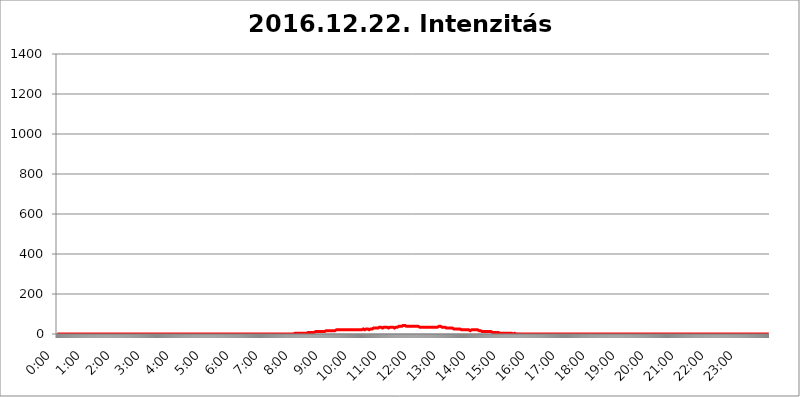
| Category | 2016.12.22. Intenzitás [W/m^2] |
|---|---|
| 0.0 | 0 |
| 0.0006944444444444445 | 0 |
| 0.001388888888888889 | 0 |
| 0.0020833333333333333 | 0 |
| 0.002777777777777778 | 0 |
| 0.003472222222222222 | 0 |
| 0.004166666666666667 | 0 |
| 0.004861111111111111 | 0 |
| 0.005555555555555556 | 0 |
| 0.0062499999999999995 | 0 |
| 0.006944444444444444 | 0 |
| 0.007638888888888889 | 0 |
| 0.008333333333333333 | 0 |
| 0.009027777777777779 | 0 |
| 0.009722222222222222 | 0 |
| 0.010416666666666666 | 0 |
| 0.011111111111111112 | 0 |
| 0.011805555555555555 | 0 |
| 0.012499999999999999 | 0 |
| 0.013194444444444444 | 0 |
| 0.013888888888888888 | 0 |
| 0.014583333333333332 | 0 |
| 0.015277777777777777 | 0 |
| 0.015972222222222224 | 0 |
| 0.016666666666666666 | 0 |
| 0.017361111111111112 | 0 |
| 0.018055555555555557 | 0 |
| 0.01875 | 0 |
| 0.019444444444444445 | 0 |
| 0.02013888888888889 | 0 |
| 0.020833333333333332 | 0 |
| 0.02152777777777778 | 0 |
| 0.022222222222222223 | 0 |
| 0.02291666666666667 | 0 |
| 0.02361111111111111 | 0 |
| 0.024305555555555556 | 0 |
| 0.024999999999999998 | 0 |
| 0.025694444444444447 | 0 |
| 0.02638888888888889 | 0 |
| 0.027083333333333334 | 0 |
| 0.027777777777777776 | 0 |
| 0.02847222222222222 | 0 |
| 0.029166666666666664 | 0 |
| 0.029861111111111113 | 0 |
| 0.030555555555555555 | 0 |
| 0.03125 | 0 |
| 0.03194444444444445 | 0 |
| 0.03263888888888889 | 0 |
| 0.03333333333333333 | 0 |
| 0.034027777777777775 | 0 |
| 0.034722222222222224 | 0 |
| 0.035416666666666666 | 0 |
| 0.036111111111111115 | 0 |
| 0.03680555555555556 | 0 |
| 0.0375 | 0 |
| 0.03819444444444444 | 0 |
| 0.03888888888888889 | 0 |
| 0.03958333333333333 | 0 |
| 0.04027777777777778 | 0 |
| 0.04097222222222222 | 0 |
| 0.041666666666666664 | 0 |
| 0.042361111111111106 | 0 |
| 0.04305555555555556 | 0 |
| 0.043750000000000004 | 0 |
| 0.044444444444444446 | 0 |
| 0.04513888888888889 | 0 |
| 0.04583333333333334 | 0 |
| 0.04652777777777778 | 0 |
| 0.04722222222222222 | 0 |
| 0.04791666666666666 | 0 |
| 0.04861111111111111 | 0 |
| 0.049305555555555554 | 0 |
| 0.049999999999999996 | 0 |
| 0.05069444444444445 | 0 |
| 0.051388888888888894 | 0 |
| 0.052083333333333336 | 0 |
| 0.05277777777777778 | 0 |
| 0.05347222222222222 | 0 |
| 0.05416666666666667 | 0 |
| 0.05486111111111111 | 0 |
| 0.05555555555555555 | 0 |
| 0.05625 | 0 |
| 0.05694444444444444 | 0 |
| 0.057638888888888885 | 0 |
| 0.05833333333333333 | 0 |
| 0.05902777777777778 | 0 |
| 0.059722222222222225 | 0 |
| 0.06041666666666667 | 0 |
| 0.061111111111111116 | 0 |
| 0.06180555555555556 | 0 |
| 0.0625 | 0 |
| 0.06319444444444444 | 0 |
| 0.06388888888888888 | 0 |
| 0.06458333333333334 | 0 |
| 0.06527777777777778 | 0 |
| 0.06597222222222222 | 0 |
| 0.06666666666666667 | 0 |
| 0.06736111111111111 | 0 |
| 0.06805555555555555 | 0 |
| 0.06874999999999999 | 0 |
| 0.06944444444444443 | 0 |
| 0.07013888888888889 | 0 |
| 0.07083333333333333 | 0 |
| 0.07152777777777779 | 0 |
| 0.07222222222222223 | 0 |
| 0.07291666666666667 | 0 |
| 0.07361111111111111 | 0 |
| 0.07430555555555556 | 0 |
| 0.075 | 0 |
| 0.07569444444444444 | 0 |
| 0.0763888888888889 | 0 |
| 0.07708333333333334 | 0 |
| 0.07777777777777778 | 0 |
| 0.07847222222222222 | 0 |
| 0.07916666666666666 | 0 |
| 0.0798611111111111 | 0 |
| 0.08055555555555556 | 0 |
| 0.08125 | 0 |
| 0.08194444444444444 | 0 |
| 0.08263888888888889 | 0 |
| 0.08333333333333333 | 0 |
| 0.08402777777777777 | 0 |
| 0.08472222222222221 | 0 |
| 0.08541666666666665 | 0 |
| 0.08611111111111112 | 0 |
| 0.08680555555555557 | 0 |
| 0.08750000000000001 | 0 |
| 0.08819444444444445 | 0 |
| 0.08888888888888889 | 0 |
| 0.08958333333333333 | 0 |
| 0.09027777777777778 | 0 |
| 0.09097222222222222 | 0 |
| 0.09166666666666667 | 0 |
| 0.09236111111111112 | 0 |
| 0.09305555555555556 | 0 |
| 0.09375 | 0 |
| 0.09444444444444444 | 0 |
| 0.09513888888888888 | 0 |
| 0.09583333333333333 | 0 |
| 0.09652777777777777 | 0 |
| 0.09722222222222222 | 0 |
| 0.09791666666666667 | 0 |
| 0.09861111111111111 | 0 |
| 0.09930555555555555 | 0 |
| 0.09999999999999999 | 0 |
| 0.10069444444444443 | 0 |
| 0.1013888888888889 | 0 |
| 0.10208333333333335 | 0 |
| 0.10277777777777779 | 0 |
| 0.10347222222222223 | 0 |
| 0.10416666666666667 | 0 |
| 0.10486111111111111 | 0 |
| 0.10555555555555556 | 0 |
| 0.10625 | 0 |
| 0.10694444444444444 | 0 |
| 0.1076388888888889 | 0 |
| 0.10833333333333334 | 0 |
| 0.10902777777777778 | 0 |
| 0.10972222222222222 | 0 |
| 0.1111111111111111 | 0 |
| 0.11180555555555556 | 0 |
| 0.11180555555555556 | 0 |
| 0.1125 | 0 |
| 0.11319444444444444 | 0 |
| 0.11388888888888889 | 0 |
| 0.11458333333333333 | 0 |
| 0.11527777777777777 | 0 |
| 0.11597222222222221 | 0 |
| 0.11666666666666665 | 0 |
| 0.1173611111111111 | 0 |
| 0.11805555555555557 | 0 |
| 0.11944444444444445 | 0 |
| 0.12013888888888889 | 0 |
| 0.12083333333333333 | 0 |
| 0.12152777777777778 | 0 |
| 0.12222222222222223 | 0 |
| 0.12291666666666667 | 0 |
| 0.12291666666666667 | 0 |
| 0.12361111111111112 | 0 |
| 0.12430555555555556 | 0 |
| 0.125 | 0 |
| 0.12569444444444444 | 0 |
| 0.12638888888888888 | 0 |
| 0.12708333333333333 | 0 |
| 0.16875 | 0 |
| 0.12847222222222224 | 0 |
| 0.12916666666666668 | 0 |
| 0.12986111111111112 | 0 |
| 0.13055555555555556 | 0 |
| 0.13125 | 0 |
| 0.13194444444444445 | 0 |
| 0.1326388888888889 | 0 |
| 0.13333333333333333 | 0 |
| 0.13402777777777777 | 0 |
| 0.13402777777777777 | 0 |
| 0.13472222222222222 | 0 |
| 0.13541666666666666 | 0 |
| 0.1361111111111111 | 0 |
| 0.13749999999999998 | 0 |
| 0.13819444444444443 | 0 |
| 0.1388888888888889 | 0 |
| 0.13958333333333334 | 0 |
| 0.14027777777777778 | 0 |
| 0.14097222222222222 | 0 |
| 0.14166666666666666 | 0 |
| 0.1423611111111111 | 0 |
| 0.14305555555555557 | 0 |
| 0.14375000000000002 | 0 |
| 0.14444444444444446 | 0 |
| 0.1451388888888889 | 0 |
| 0.1451388888888889 | 0 |
| 0.14652777777777778 | 0 |
| 0.14722222222222223 | 0 |
| 0.14791666666666667 | 0 |
| 0.1486111111111111 | 0 |
| 0.14930555555555555 | 0 |
| 0.15 | 0 |
| 0.15069444444444444 | 0 |
| 0.15138888888888888 | 0 |
| 0.15208333333333332 | 0 |
| 0.15277777777777776 | 0 |
| 0.15347222222222223 | 0 |
| 0.15416666666666667 | 0 |
| 0.15486111111111112 | 0 |
| 0.15555555555555556 | 0 |
| 0.15625 | 0 |
| 0.15694444444444444 | 0 |
| 0.15763888888888888 | 0 |
| 0.15833333333333333 | 0 |
| 0.15902777777777777 | 0 |
| 0.15972222222222224 | 0 |
| 0.16041666666666668 | 0 |
| 0.16111111111111112 | 0 |
| 0.16180555555555556 | 0 |
| 0.1625 | 0 |
| 0.16319444444444445 | 0 |
| 0.1638888888888889 | 0 |
| 0.16458333333333333 | 0 |
| 0.16527777777777777 | 0 |
| 0.16597222222222222 | 0 |
| 0.16666666666666666 | 0 |
| 0.1673611111111111 | 0 |
| 0.16805555555555554 | 0 |
| 0.16874999999999998 | 0 |
| 0.16944444444444443 | 0 |
| 0.17013888888888887 | 0 |
| 0.1708333333333333 | 0 |
| 0.17152777777777775 | 0 |
| 0.17222222222222225 | 0 |
| 0.1729166666666667 | 0 |
| 0.17361111111111113 | 0 |
| 0.17430555555555557 | 0 |
| 0.17500000000000002 | 0 |
| 0.17569444444444446 | 0 |
| 0.1763888888888889 | 0 |
| 0.17708333333333334 | 0 |
| 0.17777777777777778 | 0 |
| 0.17847222222222223 | 0 |
| 0.17916666666666667 | 0 |
| 0.1798611111111111 | 0 |
| 0.18055555555555555 | 0 |
| 0.18125 | 0 |
| 0.18194444444444444 | 0 |
| 0.1826388888888889 | 0 |
| 0.18333333333333335 | 0 |
| 0.1840277777777778 | 0 |
| 0.18472222222222223 | 0 |
| 0.18541666666666667 | 0 |
| 0.18611111111111112 | 0 |
| 0.18680555555555556 | 0 |
| 0.1875 | 0 |
| 0.18819444444444444 | 0 |
| 0.18888888888888888 | 0 |
| 0.18958333333333333 | 0 |
| 0.19027777777777777 | 0 |
| 0.1909722222222222 | 0 |
| 0.19166666666666665 | 0 |
| 0.19236111111111112 | 0 |
| 0.19305555555555554 | 0 |
| 0.19375 | 0 |
| 0.19444444444444445 | 0 |
| 0.1951388888888889 | 0 |
| 0.19583333333333333 | 0 |
| 0.19652777777777777 | 0 |
| 0.19722222222222222 | 0 |
| 0.19791666666666666 | 0 |
| 0.1986111111111111 | 0 |
| 0.19930555555555554 | 0 |
| 0.19999999999999998 | 0 |
| 0.20069444444444443 | 0 |
| 0.20138888888888887 | 0 |
| 0.2020833333333333 | 0 |
| 0.2027777777777778 | 0 |
| 0.2034722222222222 | 0 |
| 0.2041666666666667 | 0 |
| 0.20486111111111113 | 0 |
| 0.20555555555555557 | 0 |
| 0.20625000000000002 | 0 |
| 0.20694444444444446 | 0 |
| 0.2076388888888889 | 0 |
| 0.20833333333333334 | 0 |
| 0.20902777777777778 | 0 |
| 0.20972222222222223 | 0 |
| 0.21041666666666667 | 0 |
| 0.2111111111111111 | 0 |
| 0.21180555555555555 | 0 |
| 0.2125 | 0 |
| 0.21319444444444444 | 0 |
| 0.2138888888888889 | 0 |
| 0.21458333333333335 | 0 |
| 0.2152777777777778 | 0 |
| 0.21597222222222223 | 0 |
| 0.21666666666666667 | 0 |
| 0.21736111111111112 | 0 |
| 0.21805555555555556 | 0 |
| 0.21875 | 0 |
| 0.21944444444444444 | 0 |
| 0.22013888888888888 | 0 |
| 0.22083333333333333 | 0 |
| 0.22152777777777777 | 0 |
| 0.2222222222222222 | 0 |
| 0.22291666666666665 | 0 |
| 0.2236111111111111 | 0 |
| 0.22430555555555556 | 0 |
| 0.225 | 0 |
| 0.22569444444444445 | 0 |
| 0.2263888888888889 | 0 |
| 0.22708333333333333 | 0 |
| 0.22777777777777777 | 0 |
| 0.22847222222222222 | 0 |
| 0.22916666666666666 | 0 |
| 0.2298611111111111 | 0 |
| 0.23055555555555554 | 0 |
| 0.23124999999999998 | 0 |
| 0.23194444444444443 | 0 |
| 0.23263888888888887 | 0 |
| 0.2333333333333333 | 0 |
| 0.2340277777777778 | 0 |
| 0.2347222222222222 | 0 |
| 0.2354166666666667 | 0 |
| 0.23611111111111113 | 0 |
| 0.23680555555555557 | 0 |
| 0.23750000000000002 | 0 |
| 0.23819444444444446 | 0 |
| 0.2388888888888889 | 0 |
| 0.23958333333333334 | 0 |
| 0.24027777777777778 | 0 |
| 0.24097222222222223 | 0 |
| 0.24166666666666667 | 0 |
| 0.2423611111111111 | 0 |
| 0.24305555555555555 | 0 |
| 0.24375 | 0 |
| 0.24444444444444446 | 0 |
| 0.24513888888888888 | 0 |
| 0.24583333333333335 | 0 |
| 0.2465277777777778 | 0 |
| 0.24722222222222223 | 0 |
| 0.24791666666666667 | 0 |
| 0.24861111111111112 | 0 |
| 0.24930555555555556 | 0 |
| 0.25 | 0 |
| 0.25069444444444444 | 0 |
| 0.2513888888888889 | 0 |
| 0.2520833333333333 | 0 |
| 0.25277777777777777 | 0 |
| 0.2534722222222222 | 0 |
| 0.25416666666666665 | 0 |
| 0.2548611111111111 | 0 |
| 0.2555555555555556 | 0 |
| 0.25625000000000003 | 0 |
| 0.2569444444444445 | 0 |
| 0.2576388888888889 | 0 |
| 0.25833333333333336 | 0 |
| 0.2590277777777778 | 0 |
| 0.25972222222222224 | 0 |
| 0.2604166666666667 | 0 |
| 0.2611111111111111 | 0 |
| 0.26180555555555557 | 0 |
| 0.2625 | 0 |
| 0.26319444444444445 | 0 |
| 0.2638888888888889 | 0 |
| 0.26458333333333334 | 0 |
| 0.2652777777777778 | 0 |
| 0.2659722222222222 | 0 |
| 0.26666666666666666 | 0 |
| 0.2673611111111111 | 0 |
| 0.26805555555555555 | 0 |
| 0.26875 | 0 |
| 0.26944444444444443 | 0 |
| 0.2701388888888889 | 0 |
| 0.2708333333333333 | 0 |
| 0.27152777777777776 | 0 |
| 0.2722222222222222 | 0 |
| 0.27291666666666664 | 0 |
| 0.2736111111111111 | 0 |
| 0.2743055555555555 | 0 |
| 0.27499999999999997 | 0 |
| 0.27569444444444446 | 0 |
| 0.27638888888888885 | 0 |
| 0.27708333333333335 | 0 |
| 0.2777777777777778 | 0 |
| 0.27847222222222223 | 0 |
| 0.2791666666666667 | 0 |
| 0.2798611111111111 | 0 |
| 0.28055555555555556 | 0 |
| 0.28125 | 0 |
| 0.28194444444444444 | 0 |
| 0.2826388888888889 | 0 |
| 0.2833333333333333 | 0 |
| 0.28402777777777777 | 0 |
| 0.2847222222222222 | 0 |
| 0.28541666666666665 | 0 |
| 0.28611111111111115 | 0 |
| 0.28680555555555554 | 0 |
| 0.28750000000000003 | 0 |
| 0.2881944444444445 | 0 |
| 0.2888888888888889 | 0 |
| 0.28958333333333336 | 0 |
| 0.2902777777777778 | 0 |
| 0.29097222222222224 | 0 |
| 0.2916666666666667 | 0 |
| 0.2923611111111111 | 0 |
| 0.29305555555555557 | 0 |
| 0.29375 | 0 |
| 0.29444444444444445 | 0 |
| 0.2951388888888889 | 0 |
| 0.29583333333333334 | 0 |
| 0.2965277777777778 | 0 |
| 0.2972222222222222 | 0 |
| 0.29791666666666666 | 0 |
| 0.2986111111111111 | 0 |
| 0.29930555555555555 | 0 |
| 0.3 | 0 |
| 0.30069444444444443 | 0 |
| 0.3013888888888889 | 0 |
| 0.3020833333333333 | 0 |
| 0.30277777777777776 | 0 |
| 0.3034722222222222 | 0 |
| 0.30416666666666664 | 0 |
| 0.3048611111111111 | 0 |
| 0.3055555555555555 | 0 |
| 0.30624999999999997 | 0 |
| 0.3069444444444444 | 0 |
| 0.3076388888888889 | 0 |
| 0.30833333333333335 | 0 |
| 0.3090277777777778 | 0 |
| 0.30972222222222223 | 0 |
| 0.3104166666666667 | 0 |
| 0.3111111111111111 | 0 |
| 0.31180555555555556 | 0 |
| 0.3125 | 0 |
| 0.31319444444444444 | 0 |
| 0.3138888888888889 | 0 |
| 0.3145833333333333 | 0 |
| 0.31527777777777777 | 0 |
| 0.3159722222222222 | 0 |
| 0.31666666666666665 | 0 |
| 0.31736111111111115 | 0 |
| 0.31805555555555554 | 0 |
| 0.31875000000000003 | 0 |
| 0.3194444444444445 | 0 |
| 0.3201388888888889 | 0 |
| 0.32083333333333336 | 0 |
| 0.3215277777777778 | 0 |
| 0.32222222222222224 | 0 |
| 0.3229166666666667 | 0 |
| 0.3236111111111111 | 0 |
| 0.32430555555555557 | 0 |
| 0.325 | 0 |
| 0.32569444444444445 | 0 |
| 0.3263888888888889 | 0 |
| 0.32708333333333334 | 0 |
| 0.3277777777777778 | 0 |
| 0.3284722222222222 | 0 |
| 0.32916666666666666 | 0 |
| 0.3298611111111111 | 0 |
| 0.33055555555555555 | 0 |
| 0.33125 | 0 |
| 0.33194444444444443 | 3.525 |
| 0.3326388888888889 | 3.525 |
| 0.3333333333333333 | 3.525 |
| 0.3340277777777778 | 3.525 |
| 0.3347222222222222 | 3.525 |
| 0.3354166666666667 | 3.525 |
| 0.3361111111111111 | 3.525 |
| 0.3368055555555556 | 3.525 |
| 0.33749999999999997 | 3.525 |
| 0.33819444444444446 | 3.525 |
| 0.33888888888888885 | 3.525 |
| 0.33958333333333335 | 3.525 |
| 0.34027777777777773 | 3.525 |
| 0.34097222222222223 | 3.525 |
| 0.3416666666666666 | 3.525 |
| 0.3423611111111111 | 3.525 |
| 0.3430555555555555 | 3.525 |
| 0.34375 | 3.525 |
| 0.3444444444444445 | 3.525 |
| 0.3451388888888889 | 3.525 |
| 0.3458333333333334 | 3.525 |
| 0.34652777777777777 | 3.525 |
| 0.34722222222222227 | 3.525 |
| 0.34791666666666665 | 3.525 |
| 0.34861111111111115 | 3.525 |
| 0.34930555555555554 | 3.525 |
| 0.35000000000000003 | 3.525 |
| 0.3506944444444444 | 3.525 |
| 0.3513888888888889 | 7.887 |
| 0.3520833333333333 | 7.887 |
| 0.3527777777777778 | 7.887 |
| 0.3534722222222222 | 7.887 |
| 0.3541666666666667 | 7.887 |
| 0.3548611111111111 | 7.887 |
| 0.35555555555555557 | 7.887 |
| 0.35625 | 7.887 |
| 0.35694444444444445 | 7.887 |
| 0.3576388888888889 | 7.887 |
| 0.35833333333333334 | 7.887 |
| 0.3590277777777778 | 7.887 |
| 0.3597222222222222 | 7.887 |
| 0.36041666666666666 | 7.887 |
| 0.3611111111111111 | 7.887 |
| 0.36180555555555555 | 12.257 |
| 0.3625 | 12.257 |
| 0.36319444444444443 | 12.257 |
| 0.3638888888888889 | 12.257 |
| 0.3645833333333333 | 12.257 |
| 0.3652777777777778 | 12.257 |
| 0.3659722222222222 | 12.257 |
| 0.3666666666666667 | 12.257 |
| 0.3673611111111111 | 12.257 |
| 0.3680555555555556 | 12.257 |
| 0.36874999999999997 | 12.257 |
| 0.36944444444444446 | 12.257 |
| 0.37013888888888885 | 12.257 |
| 0.37083333333333335 | 12.257 |
| 0.37152777777777773 | 12.257 |
| 0.37222222222222223 | 12.257 |
| 0.3729166666666666 | 12.257 |
| 0.3736111111111111 | 12.257 |
| 0.3743055555555555 | 12.257 |
| 0.375 | 12.257 |
| 0.3756944444444445 | 12.257 |
| 0.3763888888888889 | 16.636 |
| 0.3770833333333334 | 16.636 |
| 0.37777777777777777 | 16.636 |
| 0.37847222222222227 | 16.636 |
| 0.37916666666666665 | 16.636 |
| 0.37986111111111115 | 16.636 |
| 0.38055555555555554 | 16.636 |
| 0.38125000000000003 | 16.636 |
| 0.3819444444444444 | 16.636 |
| 0.3826388888888889 | 16.636 |
| 0.3833333333333333 | 16.636 |
| 0.3840277777777778 | 16.636 |
| 0.3847222222222222 | 16.636 |
| 0.3854166666666667 | 16.636 |
| 0.3861111111111111 | 16.636 |
| 0.38680555555555557 | 16.636 |
| 0.3875 | 16.636 |
| 0.38819444444444445 | 16.636 |
| 0.3888888888888889 | 16.636 |
| 0.38958333333333334 | 16.636 |
| 0.3902777777777778 | 16.636 |
| 0.3909722222222222 | 16.636 |
| 0.39166666666666666 | 21.024 |
| 0.3923611111111111 | 21.024 |
| 0.39305555555555555 | 16.636 |
| 0.39375 | 21.024 |
| 0.39444444444444443 | 21.024 |
| 0.3951388888888889 | 21.024 |
| 0.3958333333333333 | 21.024 |
| 0.3965277777777778 | 21.024 |
| 0.3972222222222222 | 21.024 |
| 0.3979166666666667 | 21.024 |
| 0.3986111111111111 | 21.024 |
| 0.3993055555555556 | 21.024 |
| 0.39999999999999997 | 21.024 |
| 0.40069444444444446 | 21.024 |
| 0.40138888888888885 | 21.024 |
| 0.40208333333333335 | 21.024 |
| 0.40277777777777773 | 21.024 |
| 0.40347222222222223 | 21.024 |
| 0.4041666666666666 | 21.024 |
| 0.4048611111111111 | 21.024 |
| 0.4055555555555555 | 21.024 |
| 0.40625 | 21.024 |
| 0.4069444444444445 | 21.024 |
| 0.4076388888888889 | 21.024 |
| 0.4083333333333334 | 21.024 |
| 0.40902777777777777 | 21.024 |
| 0.40972222222222227 | 21.024 |
| 0.41041666666666665 | 21.024 |
| 0.41111111111111115 | 21.024 |
| 0.41180555555555554 | 21.024 |
| 0.41250000000000003 | 21.024 |
| 0.4131944444444444 | 21.024 |
| 0.4138888888888889 | 21.024 |
| 0.4145833333333333 | 21.024 |
| 0.4152777777777778 | 21.024 |
| 0.4159722222222222 | 21.024 |
| 0.4166666666666667 | 21.024 |
| 0.4173611111111111 | 21.024 |
| 0.41805555555555557 | 21.024 |
| 0.41875 | 21.024 |
| 0.41944444444444445 | 21.024 |
| 0.4201388888888889 | 21.024 |
| 0.42083333333333334 | 21.024 |
| 0.4215277777777778 | 21.024 |
| 0.4222222222222222 | 21.024 |
| 0.42291666666666666 | 21.024 |
| 0.4236111111111111 | 21.024 |
| 0.42430555555555555 | 21.024 |
| 0.425 | 21.024 |
| 0.42569444444444443 | 21.024 |
| 0.4263888888888889 | 21.024 |
| 0.4270833333333333 | 21.024 |
| 0.4277777777777778 | 21.024 |
| 0.4284722222222222 | 21.024 |
| 0.4291666666666667 | 25.419 |
| 0.4298611111111111 | 25.419 |
| 0.4305555555555556 | 21.024 |
| 0.43124999999999997 | 21.024 |
| 0.43194444444444446 | 21.024 |
| 0.43263888888888885 | 21.024 |
| 0.43333333333333335 | 25.419 |
| 0.43402777777777773 | 21.024 |
| 0.43472222222222223 | 21.024 |
| 0.4354166666666666 | 25.419 |
| 0.4361111111111111 | 25.419 |
| 0.4368055555555555 | 21.024 |
| 0.4375 | 21.024 |
| 0.4381944444444445 | 25.419 |
| 0.4388888888888889 | 25.419 |
| 0.4395833333333334 | 25.419 |
| 0.44027777777777777 | 25.419 |
| 0.44097222222222227 | 25.419 |
| 0.44166666666666665 | 25.419 |
| 0.44236111111111115 | 25.419 |
| 0.44305555555555554 | 25.419 |
| 0.44375000000000003 | 29.823 |
| 0.4444444444444444 | 29.823 |
| 0.4451388888888889 | 29.823 |
| 0.4458333333333333 | 29.823 |
| 0.4465277777777778 | 29.823 |
| 0.4472222222222222 | 29.823 |
| 0.4479166666666667 | 29.823 |
| 0.4486111111111111 | 29.823 |
| 0.44930555555555557 | 29.823 |
| 0.45 | 29.823 |
| 0.45069444444444445 | 29.823 |
| 0.4513888888888889 | 29.823 |
| 0.45208333333333334 | 34.234 |
| 0.4527777777777778 | 34.234 |
| 0.4534722222222222 | 34.234 |
| 0.45416666666666666 | 34.234 |
| 0.4548611111111111 | 34.234 |
| 0.45555555555555555 | 29.823 |
| 0.45625 | 29.823 |
| 0.45694444444444443 | 34.234 |
| 0.4576388888888889 | 34.234 |
| 0.4583333333333333 | 34.234 |
| 0.4590277777777778 | 34.234 |
| 0.4597222222222222 | 34.234 |
| 0.4604166666666667 | 34.234 |
| 0.4611111111111111 | 34.234 |
| 0.4618055555555556 | 34.234 |
| 0.46249999999999997 | 34.234 |
| 0.46319444444444446 | 34.234 |
| 0.46388888888888885 | 34.234 |
| 0.46458333333333335 | 29.823 |
| 0.46527777777777773 | 34.234 |
| 0.46597222222222223 | 34.234 |
| 0.4666666666666666 | 34.234 |
| 0.4673611111111111 | 34.234 |
| 0.4680555555555555 | 34.234 |
| 0.46875 | 34.234 |
| 0.4694444444444445 | 34.234 |
| 0.4701388888888889 | 34.234 |
| 0.4708333333333334 | 34.234 |
| 0.47152777777777777 | 34.234 |
| 0.47222222222222227 | 34.234 |
| 0.47291666666666665 | 29.823 |
| 0.47361111111111115 | 29.823 |
| 0.47430555555555554 | 29.823 |
| 0.47500000000000003 | 34.234 |
| 0.4756944444444444 | 34.234 |
| 0.4763888888888889 | 34.234 |
| 0.4770833333333333 | 34.234 |
| 0.4777777777777778 | 34.234 |
| 0.4784722222222222 | 34.234 |
| 0.4791666666666667 | 38.653 |
| 0.4798611111111111 | 38.653 |
| 0.48055555555555557 | 38.653 |
| 0.48125 | 38.653 |
| 0.48194444444444445 | 38.653 |
| 0.4826388888888889 | 38.653 |
| 0.48333333333333334 | 38.653 |
| 0.4840277777777778 | 43.079 |
| 0.4847222222222222 | 43.079 |
| 0.48541666666666666 | 43.079 |
| 0.4861111111111111 | 43.079 |
| 0.48680555555555555 | 43.079 |
| 0.4875 | 43.079 |
| 0.48819444444444443 | 43.079 |
| 0.4888888888888889 | 43.079 |
| 0.4895833333333333 | 38.653 |
| 0.4902777777777778 | 38.653 |
| 0.4909722222222222 | 38.653 |
| 0.4916666666666667 | 38.653 |
| 0.4923611111111111 | 38.653 |
| 0.4930555555555556 | 38.653 |
| 0.49374999999999997 | 38.653 |
| 0.49444444444444446 | 38.653 |
| 0.49513888888888885 | 38.653 |
| 0.49583333333333335 | 38.653 |
| 0.49652777777777773 | 38.653 |
| 0.49722222222222223 | 38.653 |
| 0.4979166666666666 | 38.653 |
| 0.4986111111111111 | 38.653 |
| 0.4993055555555555 | 38.653 |
| 0.5 | 38.653 |
| 0.5006944444444444 | 38.653 |
| 0.5013888888888889 | 38.653 |
| 0.5020833333333333 | 38.653 |
| 0.5027777777777778 | 38.653 |
| 0.5034722222222222 | 38.653 |
| 0.5041666666666667 | 38.653 |
| 0.5048611111111111 | 38.653 |
| 0.5055555555555555 | 38.653 |
| 0.50625 | 38.653 |
| 0.5069444444444444 | 34.234 |
| 0.5076388888888889 | 34.234 |
| 0.5083333333333333 | 34.234 |
| 0.5090277777777777 | 34.234 |
| 0.5097222222222222 | 34.234 |
| 0.5104166666666666 | 34.234 |
| 0.5111111111111112 | 34.234 |
| 0.5118055555555555 | 34.234 |
| 0.5125000000000001 | 34.234 |
| 0.5131944444444444 | 34.234 |
| 0.513888888888889 | 34.234 |
| 0.5145833333333333 | 34.234 |
| 0.5152777777777778 | 34.234 |
| 0.5159722222222222 | 34.234 |
| 0.5166666666666667 | 34.234 |
| 0.517361111111111 | 34.234 |
| 0.5180555555555556 | 34.234 |
| 0.5187499999999999 | 34.234 |
| 0.5194444444444445 | 34.234 |
| 0.5201388888888888 | 34.234 |
| 0.5208333333333334 | 34.234 |
| 0.5215277777777778 | 34.234 |
| 0.5222222222222223 | 34.234 |
| 0.5229166666666667 | 34.234 |
| 0.5236111111111111 | 34.234 |
| 0.5243055555555556 | 34.234 |
| 0.525 | 34.234 |
| 0.5256944444444445 | 34.234 |
| 0.5263888888888889 | 34.234 |
| 0.5270833333333333 | 34.234 |
| 0.5277777777777778 | 34.234 |
| 0.5284722222222222 | 34.234 |
| 0.5291666666666667 | 34.234 |
| 0.5298611111111111 | 34.234 |
| 0.5305555555555556 | 34.234 |
| 0.53125 | 34.234 |
| 0.5319444444444444 | 34.234 |
| 0.5326388888888889 | 34.234 |
| 0.5333333333333333 | 34.234 |
| 0.5340277777777778 | 34.234 |
| 0.5347222222222222 | 38.653 |
| 0.5354166666666667 | 38.653 |
| 0.5361111111111111 | 38.653 |
| 0.5368055555555555 | 38.653 |
| 0.5375 | 38.653 |
| 0.5381944444444444 | 34.234 |
| 0.5388888888888889 | 34.234 |
| 0.5395833333333333 | 34.234 |
| 0.5402777777777777 | 34.234 |
| 0.5409722222222222 | 34.234 |
| 0.5416666666666666 | 34.234 |
| 0.5423611111111112 | 34.234 |
| 0.5430555555555555 | 34.234 |
| 0.5437500000000001 | 34.234 |
| 0.5444444444444444 | 29.823 |
| 0.545138888888889 | 29.823 |
| 0.5458333333333333 | 29.823 |
| 0.5465277777777778 | 29.823 |
| 0.5472222222222222 | 29.823 |
| 0.5479166666666667 | 29.823 |
| 0.548611111111111 | 29.823 |
| 0.5493055555555556 | 29.823 |
| 0.5499999999999999 | 29.823 |
| 0.5506944444444445 | 29.823 |
| 0.5513888888888888 | 29.823 |
| 0.5520833333333334 | 29.823 |
| 0.5527777777777778 | 29.823 |
| 0.5534722222222223 | 29.823 |
| 0.5541666666666667 | 29.823 |
| 0.5548611111111111 | 25.419 |
| 0.5555555555555556 | 25.419 |
| 0.55625 | 25.419 |
| 0.5569444444444445 | 25.419 |
| 0.5576388888888889 | 25.419 |
| 0.5583333333333333 | 25.419 |
| 0.5590277777777778 | 25.419 |
| 0.5597222222222222 | 25.419 |
| 0.5604166666666667 | 25.419 |
| 0.5611111111111111 | 25.419 |
| 0.5618055555555556 | 25.419 |
| 0.5625 | 25.419 |
| 0.5631944444444444 | 25.419 |
| 0.5638888888888889 | 25.419 |
| 0.5645833333333333 | 25.419 |
| 0.5652777777777778 | 21.024 |
| 0.5659722222222222 | 21.024 |
| 0.5666666666666667 | 21.024 |
| 0.5673611111111111 | 21.024 |
| 0.5680555555555555 | 21.024 |
| 0.56875 | 21.024 |
| 0.5694444444444444 | 21.024 |
| 0.5701388888888889 | 21.024 |
| 0.5708333333333333 | 21.024 |
| 0.5715277777777777 | 21.024 |
| 0.5722222222222222 | 21.024 |
| 0.5729166666666666 | 21.024 |
| 0.5736111111111112 | 21.024 |
| 0.5743055555555555 | 21.024 |
| 0.5750000000000001 | 21.024 |
| 0.5756944444444444 | 21.024 |
| 0.576388888888889 | 21.024 |
| 0.5770833333333333 | 21.024 |
| 0.5777777777777778 | 16.636 |
| 0.5784722222222222 | 16.636 |
| 0.5791666666666667 | 16.636 |
| 0.579861111111111 | 16.636 |
| 0.5805555555555556 | 16.636 |
| 0.5812499999999999 | 21.024 |
| 0.5819444444444445 | 21.024 |
| 0.5826388888888888 | 21.024 |
| 0.5833333333333334 | 21.024 |
| 0.5840277777777778 | 21.024 |
| 0.5847222222222223 | 21.024 |
| 0.5854166666666667 | 21.024 |
| 0.5861111111111111 | 21.024 |
| 0.5868055555555556 | 21.024 |
| 0.5875 | 21.024 |
| 0.5881944444444445 | 21.024 |
| 0.5888888888888889 | 21.024 |
| 0.5895833333333333 | 21.024 |
| 0.5902777777777778 | 16.636 |
| 0.5909722222222222 | 16.636 |
| 0.5916666666666667 | 16.636 |
| 0.5923611111111111 | 16.636 |
| 0.5930555555555556 | 16.636 |
| 0.59375 | 16.636 |
| 0.5944444444444444 | 16.636 |
| 0.5951388888888889 | 16.636 |
| 0.5958333333333333 | 12.257 |
| 0.5965277777777778 | 12.257 |
| 0.5972222222222222 | 12.257 |
| 0.5979166666666667 | 12.257 |
| 0.5986111111111111 | 12.257 |
| 0.5993055555555555 | 12.257 |
| 0.6 | 12.257 |
| 0.6006944444444444 | 12.257 |
| 0.6013888888888889 | 12.257 |
| 0.6020833333333333 | 12.257 |
| 0.6027777777777777 | 12.257 |
| 0.6034722222222222 | 12.257 |
| 0.6041666666666666 | 12.257 |
| 0.6048611111111112 | 12.257 |
| 0.6055555555555555 | 12.257 |
| 0.6062500000000001 | 12.257 |
| 0.6069444444444444 | 12.257 |
| 0.607638888888889 | 12.257 |
| 0.6083333333333333 | 12.257 |
| 0.6090277777777778 | 7.887 |
| 0.6097222222222222 | 7.887 |
| 0.6104166666666667 | 7.887 |
| 0.611111111111111 | 7.887 |
| 0.6118055555555556 | 7.887 |
| 0.6124999999999999 | 7.887 |
| 0.6131944444444445 | 7.887 |
| 0.6138888888888888 | 7.887 |
| 0.6145833333333334 | 7.887 |
| 0.6152777777777778 | 7.887 |
| 0.6159722222222223 | 7.887 |
| 0.6166666666666667 | 7.887 |
| 0.6173611111111111 | 7.887 |
| 0.6180555555555556 | 7.887 |
| 0.61875 | 7.887 |
| 0.6194444444444445 | 3.525 |
| 0.6201388888888889 | 3.525 |
| 0.6208333333333333 | 3.525 |
| 0.6215277777777778 | 3.525 |
| 0.6222222222222222 | 7.887 |
| 0.6229166666666667 | 3.525 |
| 0.6236111111111111 | 3.525 |
| 0.6243055555555556 | 3.525 |
| 0.625 | 3.525 |
| 0.6256944444444444 | 3.525 |
| 0.6263888888888889 | 3.525 |
| 0.6270833333333333 | 3.525 |
| 0.6277777777777778 | 3.525 |
| 0.6284722222222222 | 3.525 |
| 0.6291666666666667 | 3.525 |
| 0.6298611111111111 | 3.525 |
| 0.6305555555555555 | 3.525 |
| 0.63125 | 3.525 |
| 0.6319444444444444 | 3.525 |
| 0.6326388888888889 | 3.525 |
| 0.6333333333333333 | 3.525 |
| 0.6340277777777777 | 3.525 |
| 0.6347222222222222 | 3.525 |
| 0.6354166666666666 | 3.525 |
| 0.6361111111111112 | 3.525 |
| 0.6368055555555555 | 3.525 |
| 0.6375000000000001 | 3.525 |
| 0.6381944444444444 | 3.525 |
| 0.638888888888889 | 3.525 |
| 0.6395833333333333 | 0 |
| 0.6402777777777778 | 0 |
| 0.6409722222222222 | 0 |
| 0.6416666666666667 | 3.525 |
| 0.642361111111111 | 0 |
| 0.6430555555555556 | 0 |
| 0.6437499999999999 | 0 |
| 0.6444444444444445 | 0 |
| 0.6451388888888888 | 0 |
| 0.6458333333333334 | 0 |
| 0.6465277777777778 | 0 |
| 0.6472222222222223 | 0 |
| 0.6479166666666667 | 0 |
| 0.6486111111111111 | 0 |
| 0.6493055555555556 | 0 |
| 0.65 | 0 |
| 0.6506944444444445 | 0 |
| 0.6513888888888889 | 0 |
| 0.6520833333333333 | 0 |
| 0.6527777777777778 | 0 |
| 0.6534722222222222 | 0 |
| 0.6541666666666667 | 0 |
| 0.6548611111111111 | 0 |
| 0.6555555555555556 | 0 |
| 0.65625 | 0 |
| 0.6569444444444444 | 0 |
| 0.6576388888888889 | 0 |
| 0.6583333333333333 | 0 |
| 0.6590277777777778 | 0 |
| 0.6597222222222222 | 0 |
| 0.6604166666666667 | 0 |
| 0.6611111111111111 | 0 |
| 0.6618055555555555 | 0 |
| 0.6625 | 0 |
| 0.6631944444444444 | 0 |
| 0.6638888888888889 | 0 |
| 0.6645833333333333 | 0 |
| 0.6652777777777777 | 0 |
| 0.6659722222222222 | 0 |
| 0.6666666666666666 | 0 |
| 0.6673611111111111 | 0 |
| 0.6680555555555556 | 0 |
| 0.6687500000000001 | 0 |
| 0.6694444444444444 | 0 |
| 0.6701388888888888 | 0 |
| 0.6708333333333334 | 0 |
| 0.6715277777777778 | 0 |
| 0.6722222222222222 | 0 |
| 0.6729166666666666 | 0 |
| 0.6736111111111112 | 0 |
| 0.6743055555555556 | 0 |
| 0.6749999999999999 | 0 |
| 0.6756944444444444 | 0 |
| 0.6763888888888889 | 0 |
| 0.6770833333333334 | 0 |
| 0.6777777777777777 | 0 |
| 0.6784722222222223 | 0 |
| 0.6791666666666667 | 0 |
| 0.6798611111111111 | 0 |
| 0.6805555555555555 | 0 |
| 0.68125 | 0 |
| 0.6819444444444445 | 0 |
| 0.6826388888888889 | 0 |
| 0.6833333333333332 | 0 |
| 0.6840277777777778 | 0 |
| 0.6847222222222222 | 0 |
| 0.6854166666666667 | 0 |
| 0.686111111111111 | 0 |
| 0.6868055555555556 | 0 |
| 0.6875 | 0 |
| 0.6881944444444444 | 0 |
| 0.688888888888889 | 0 |
| 0.6895833333333333 | 0 |
| 0.6902777777777778 | 0 |
| 0.6909722222222222 | 0 |
| 0.6916666666666668 | 0 |
| 0.6923611111111111 | 0 |
| 0.6930555555555555 | 0 |
| 0.69375 | 0 |
| 0.6944444444444445 | 0 |
| 0.6951388888888889 | 0 |
| 0.6958333333333333 | 0 |
| 0.6965277777777777 | 0 |
| 0.6972222222222223 | 0 |
| 0.6979166666666666 | 0 |
| 0.6986111111111111 | 0 |
| 0.6993055555555556 | 0 |
| 0.7000000000000001 | 0 |
| 0.7006944444444444 | 0 |
| 0.7013888888888888 | 0 |
| 0.7020833333333334 | 0 |
| 0.7027777777777778 | 0 |
| 0.7034722222222222 | 0 |
| 0.7041666666666666 | 0 |
| 0.7048611111111112 | 0 |
| 0.7055555555555556 | 0 |
| 0.7062499999999999 | 0 |
| 0.7069444444444444 | 0 |
| 0.7076388888888889 | 0 |
| 0.7083333333333334 | 0 |
| 0.7090277777777777 | 0 |
| 0.7097222222222223 | 0 |
| 0.7104166666666667 | 0 |
| 0.7111111111111111 | 0 |
| 0.7118055555555555 | 0 |
| 0.7125 | 0 |
| 0.7131944444444445 | 0 |
| 0.7138888888888889 | 0 |
| 0.7145833333333332 | 0 |
| 0.7152777777777778 | 0 |
| 0.7159722222222222 | 0 |
| 0.7166666666666667 | 0 |
| 0.717361111111111 | 0 |
| 0.7180555555555556 | 0 |
| 0.71875 | 0 |
| 0.7194444444444444 | 0 |
| 0.720138888888889 | 0 |
| 0.7208333333333333 | 0 |
| 0.7215277777777778 | 0 |
| 0.7222222222222222 | 0 |
| 0.7229166666666668 | 0 |
| 0.7236111111111111 | 0 |
| 0.7243055555555555 | 0 |
| 0.725 | 0 |
| 0.7256944444444445 | 0 |
| 0.7263888888888889 | 0 |
| 0.7270833333333333 | 0 |
| 0.7277777777777777 | 0 |
| 0.7284722222222223 | 0 |
| 0.7291666666666666 | 0 |
| 0.7298611111111111 | 0 |
| 0.7305555555555556 | 0 |
| 0.7312500000000001 | 0 |
| 0.7319444444444444 | 0 |
| 0.7326388888888888 | 0 |
| 0.7333333333333334 | 0 |
| 0.7340277777777778 | 0 |
| 0.7347222222222222 | 0 |
| 0.7354166666666666 | 0 |
| 0.7361111111111112 | 0 |
| 0.7368055555555556 | 0 |
| 0.7374999999999999 | 0 |
| 0.7381944444444444 | 0 |
| 0.7388888888888889 | 0 |
| 0.7395833333333334 | 0 |
| 0.7402777777777777 | 0 |
| 0.7409722222222223 | 0 |
| 0.7416666666666667 | 0 |
| 0.7423611111111111 | 0 |
| 0.7430555555555555 | 0 |
| 0.74375 | 0 |
| 0.7444444444444445 | 0 |
| 0.7451388888888889 | 0 |
| 0.7458333333333332 | 0 |
| 0.7465277777777778 | 0 |
| 0.7472222222222222 | 0 |
| 0.7479166666666667 | 0 |
| 0.748611111111111 | 0 |
| 0.7493055555555556 | 0 |
| 0.75 | 0 |
| 0.7506944444444444 | 0 |
| 0.751388888888889 | 0 |
| 0.7520833333333333 | 0 |
| 0.7527777777777778 | 0 |
| 0.7534722222222222 | 0 |
| 0.7541666666666668 | 0 |
| 0.7548611111111111 | 0 |
| 0.7555555555555555 | 0 |
| 0.75625 | 0 |
| 0.7569444444444445 | 0 |
| 0.7576388888888889 | 0 |
| 0.7583333333333333 | 0 |
| 0.7590277777777777 | 0 |
| 0.7597222222222223 | 0 |
| 0.7604166666666666 | 0 |
| 0.7611111111111111 | 0 |
| 0.7618055555555556 | 0 |
| 0.7625000000000001 | 0 |
| 0.7631944444444444 | 0 |
| 0.7638888888888888 | 0 |
| 0.7645833333333334 | 0 |
| 0.7652777777777778 | 0 |
| 0.7659722222222222 | 0 |
| 0.7666666666666666 | 0 |
| 0.7673611111111112 | 0 |
| 0.7680555555555556 | 0 |
| 0.7687499999999999 | 0 |
| 0.7694444444444444 | 0 |
| 0.7701388888888889 | 0 |
| 0.7708333333333334 | 0 |
| 0.7715277777777777 | 0 |
| 0.7722222222222223 | 0 |
| 0.7729166666666667 | 0 |
| 0.7736111111111111 | 0 |
| 0.7743055555555555 | 0 |
| 0.775 | 0 |
| 0.7756944444444445 | 0 |
| 0.7763888888888889 | 0 |
| 0.7770833333333332 | 0 |
| 0.7777777777777778 | 0 |
| 0.7784722222222222 | 0 |
| 0.7791666666666667 | 0 |
| 0.779861111111111 | 0 |
| 0.7805555555555556 | 0 |
| 0.78125 | 0 |
| 0.7819444444444444 | 0 |
| 0.782638888888889 | 0 |
| 0.7833333333333333 | 0 |
| 0.7840277777777778 | 0 |
| 0.7847222222222222 | 0 |
| 0.7854166666666668 | 0 |
| 0.7861111111111111 | 0 |
| 0.7868055555555555 | 0 |
| 0.7875 | 0 |
| 0.7881944444444445 | 0 |
| 0.7888888888888889 | 0 |
| 0.7895833333333333 | 0 |
| 0.7902777777777777 | 0 |
| 0.7909722222222223 | 0 |
| 0.7916666666666666 | 0 |
| 0.7923611111111111 | 0 |
| 0.7930555555555556 | 0 |
| 0.7937500000000001 | 0 |
| 0.7944444444444444 | 0 |
| 0.7951388888888888 | 0 |
| 0.7958333333333334 | 0 |
| 0.7965277777777778 | 0 |
| 0.7972222222222222 | 0 |
| 0.7979166666666666 | 0 |
| 0.7986111111111112 | 0 |
| 0.7993055555555556 | 0 |
| 0.7999999999999999 | 0 |
| 0.8006944444444444 | 0 |
| 0.8013888888888889 | 0 |
| 0.8020833333333334 | 0 |
| 0.8027777777777777 | 0 |
| 0.8034722222222223 | 0 |
| 0.8041666666666667 | 0 |
| 0.8048611111111111 | 0 |
| 0.8055555555555555 | 0 |
| 0.80625 | 0 |
| 0.8069444444444445 | 0 |
| 0.8076388888888889 | 0 |
| 0.8083333333333332 | 0 |
| 0.8090277777777778 | 0 |
| 0.8097222222222222 | 0 |
| 0.8104166666666667 | 0 |
| 0.811111111111111 | 0 |
| 0.8118055555555556 | 0 |
| 0.8125 | 0 |
| 0.8131944444444444 | 0 |
| 0.813888888888889 | 0 |
| 0.8145833333333333 | 0 |
| 0.8152777777777778 | 0 |
| 0.8159722222222222 | 0 |
| 0.8166666666666668 | 0 |
| 0.8173611111111111 | 0 |
| 0.8180555555555555 | 0 |
| 0.81875 | 0 |
| 0.8194444444444445 | 0 |
| 0.8201388888888889 | 0 |
| 0.8208333333333333 | 0 |
| 0.8215277777777777 | 0 |
| 0.8222222222222223 | 0 |
| 0.8229166666666666 | 0 |
| 0.8236111111111111 | 0 |
| 0.8243055555555556 | 0 |
| 0.8250000000000001 | 0 |
| 0.8256944444444444 | 0 |
| 0.8263888888888888 | 0 |
| 0.8270833333333334 | 0 |
| 0.8277777777777778 | 0 |
| 0.8284722222222222 | 0 |
| 0.8291666666666666 | 0 |
| 0.8298611111111112 | 0 |
| 0.8305555555555556 | 0 |
| 0.8312499999999999 | 0 |
| 0.8319444444444444 | 0 |
| 0.8326388888888889 | 0 |
| 0.8333333333333334 | 0 |
| 0.8340277777777777 | 0 |
| 0.8347222222222223 | 0 |
| 0.8354166666666667 | 0 |
| 0.8361111111111111 | 0 |
| 0.8368055555555555 | 0 |
| 0.8375 | 0 |
| 0.8381944444444445 | 0 |
| 0.8388888888888889 | 0 |
| 0.8395833333333332 | 0 |
| 0.8402777777777778 | 0 |
| 0.8409722222222222 | 0 |
| 0.8416666666666667 | 0 |
| 0.842361111111111 | 0 |
| 0.8430555555555556 | 0 |
| 0.84375 | 0 |
| 0.8444444444444444 | 0 |
| 0.845138888888889 | 0 |
| 0.8458333333333333 | 0 |
| 0.8465277777777778 | 0 |
| 0.8472222222222222 | 0 |
| 0.8479166666666668 | 0 |
| 0.8486111111111111 | 0 |
| 0.8493055555555555 | 0 |
| 0.85 | 0 |
| 0.8506944444444445 | 0 |
| 0.8513888888888889 | 0 |
| 0.8520833333333333 | 0 |
| 0.8527777777777777 | 0 |
| 0.8534722222222223 | 0 |
| 0.8541666666666666 | 0 |
| 0.8548611111111111 | 0 |
| 0.8555555555555556 | 0 |
| 0.8562500000000001 | 0 |
| 0.8569444444444444 | 0 |
| 0.8576388888888888 | 0 |
| 0.8583333333333334 | 0 |
| 0.8590277777777778 | 0 |
| 0.8597222222222222 | 0 |
| 0.8604166666666666 | 0 |
| 0.8611111111111112 | 0 |
| 0.8618055555555556 | 0 |
| 0.8624999999999999 | 0 |
| 0.8631944444444444 | 0 |
| 0.8638888888888889 | 0 |
| 0.8645833333333334 | 0 |
| 0.8652777777777777 | 0 |
| 0.8659722222222223 | 0 |
| 0.8666666666666667 | 0 |
| 0.8673611111111111 | 0 |
| 0.8680555555555555 | 0 |
| 0.86875 | 0 |
| 0.8694444444444445 | 0 |
| 0.8701388888888889 | 0 |
| 0.8708333333333332 | 0 |
| 0.8715277777777778 | 0 |
| 0.8722222222222222 | 0 |
| 0.8729166666666667 | 0 |
| 0.873611111111111 | 0 |
| 0.8743055555555556 | 0 |
| 0.875 | 0 |
| 0.8756944444444444 | 0 |
| 0.876388888888889 | 0 |
| 0.8770833333333333 | 0 |
| 0.8777777777777778 | 0 |
| 0.8784722222222222 | 0 |
| 0.8791666666666668 | 0 |
| 0.8798611111111111 | 0 |
| 0.8805555555555555 | 0 |
| 0.88125 | 0 |
| 0.8819444444444445 | 0 |
| 0.8826388888888889 | 0 |
| 0.8833333333333333 | 0 |
| 0.8840277777777777 | 0 |
| 0.8847222222222223 | 0 |
| 0.8854166666666666 | 0 |
| 0.8861111111111111 | 0 |
| 0.8868055555555556 | 0 |
| 0.8875000000000001 | 0 |
| 0.8881944444444444 | 0 |
| 0.8888888888888888 | 0 |
| 0.8895833333333334 | 0 |
| 0.8902777777777778 | 0 |
| 0.8909722222222222 | 0 |
| 0.8916666666666666 | 0 |
| 0.8923611111111112 | 0 |
| 0.8930555555555556 | 0 |
| 0.8937499999999999 | 0 |
| 0.8944444444444444 | 0 |
| 0.8951388888888889 | 0 |
| 0.8958333333333334 | 0 |
| 0.8965277777777777 | 0 |
| 0.8972222222222223 | 0 |
| 0.8979166666666667 | 0 |
| 0.8986111111111111 | 0 |
| 0.8993055555555555 | 0 |
| 0.9 | 0 |
| 0.9006944444444445 | 0 |
| 0.9013888888888889 | 0 |
| 0.9020833333333332 | 0 |
| 0.9027777777777778 | 0 |
| 0.9034722222222222 | 0 |
| 0.9041666666666667 | 0 |
| 0.904861111111111 | 0 |
| 0.9055555555555556 | 0 |
| 0.90625 | 0 |
| 0.9069444444444444 | 0 |
| 0.907638888888889 | 0 |
| 0.9083333333333333 | 0 |
| 0.9090277777777778 | 0 |
| 0.9097222222222222 | 0 |
| 0.9104166666666668 | 0 |
| 0.9111111111111111 | 0 |
| 0.9118055555555555 | 0 |
| 0.9125 | 0 |
| 0.9131944444444445 | 0 |
| 0.9138888888888889 | 0 |
| 0.9145833333333333 | 0 |
| 0.9152777777777777 | 0 |
| 0.9159722222222223 | 0 |
| 0.9166666666666666 | 0 |
| 0.9173611111111111 | 0 |
| 0.9180555555555556 | 0 |
| 0.9187500000000001 | 0 |
| 0.9194444444444444 | 0 |
| 0.9201388888888888 | 0 |
| 0.9208333333333334 | 0 |
| 0.9215277777777778 | 0 |
| 0.9222222222222222 | 0 |
| 0.9229166666666666 | 0 |
| 0.9236111111111112 | 0 |
| 0.9243055555555556 | 0 |
| 0.9249999999999999 | 0 |
| 0.9256944444444444 | 0 |
| 0.9263888888888889 | 0 |
| 0.9270833333333334 | 0 |
| 0.9277777777777777 | 0 |
| 0.9284722222222223 | 0 |
| 0.9291666666666667 | 0 |
| 0.9298611111111111 | 0 |
| 0.9305555555555555 | 0 |
| 0.93125 | 0 |
| 0.9319444444444445 | 0 |
| 0.9326388888888889 | 0 |
| 0.9333333333333332 | 0 |
| 0.9340277777777778 | 0 |
| 0.9347222222222222 | 0 |
| 0.9354166666666667 | 0 |
| 0.936111111111111 | 0 |
| 0.9368055555555556 | 0 |
| 0.9375 | 0 |
| 0.9381944444444444 | 0 |
| 0.938888888888889 | 0 |
| 0.9395833333333333 | 0 |
| 0.9402777777777778 | 0 |
| 0.9409722222222222 | 0 |
| 0.9416666666666668 | 0 |
| 0.9423611111111111 | 0 |
| 0.9430555555555555 | 0 |
| 0.94375 | 0 |
| 0.9444444444444445 | 0 |
| 0.9451388888888889 | 0 |
| 0.9458333333333333 | 0 |
| 0.9465277777777777 | 0 |
| 0.9472222222222223 | 0 |
| 0.9479166666666666 | 0 |
| 0.9486111111111111 | 0 |
| 0.9493055555555556 | 0 |
| 0.9500000000000001 | 0 |
| 0.9506944444444444 | 0 |
| 0.9513888888888888 | 0 |
| 0.9520833333333334 | 0 |
| 0.9527777777777778 | 0 |
| 0.9534722222222222 | 0 |
| 0.9541666666666666 | 0 |
| 0.9548611111111112 | 0 |
| 0.9555555555555556 | 0 |
| 0.9562499999999999 | 0 |
| 0.9569444444444444 | 0 |
| 0.9576388888888889 | 0 |
| 0.9583333333333334 | 0 |
| 0.9590277777777777 | 0 |
| 0.9597222222222223 | 0 |
| 0.9604166666666667 | 0 |
| 0.9611111111111111 | 0 |
| 0.9618055555555555 | 0 |
| 0.9625 | 0 |
| 0.9631944444444445 | 0 |
| 0.9638888888888889 | 0 |
| 0.9645833333333332 | 0 |
| 0.9652777777777778 | 0 |
| 0.9659722222222222 | 0 |
| 0.9666666666666667 | 0 |
| 0.967361111111111 | 0 |
| 0.9680555555555556 | 0 |
| 0.96875 | 0 |
| 0.9694444444444444 | 0 |
| 0.970138888888889 | 0 |
| 0.9708333333333333 | 0 |
| 0.9715277777777778 | 0 |
| 0.9722222222222222 | 0 |
| 0.9729166666666668 | 0 |
| 0.9736111111111111 | 0 |
| 0.9743055555555555 | 0 |
| 0.975 | 0 |
| 0.9756944444444445 | 0 |
| 0.9763888888888889 | 0 |
| 0.9770833333333333 | 0 |
| 0.9777777777777777 | 0 |
| 0.9784722222222223 | 0 |
| 0.9791666666666666 | 0 |
| 0.9798611111111111 | 0 |
| 0.9805555555555556 | 0 |
| 0.9812500000000001 | 0 |
| 0.9819444444444444 | 0 |
| 0.9826388888888888 | 0 |
| 0.9833333333333334 | 0 |
| 0.9840277777777778 | 0 |
| 0.9847222222222222 | 0 |
| 0.9854166666666666 | 0 |
| 0.9861111111111112 | 0 |
| 0.9868055555555556 | 0 |
| 0.9874999999999999 | 0 |
| 0.9881944444444444 | 0 |
| 0.9888888888888889 | 0 |
| 0.9895833333333334 | 0 |
| 0.9902777777777777 | 0 |
| 0.9909722222222223 | 0 |
| 0.9916666666666667 | 0 |
| 0.9923611111111111 | 0 |
| 0.9930555555555555 | 0 |
| 0.99375 | 0 |
| 0.9944444444444445 | 0 |
| 0.9951388888888889 | 0 |
| 0.9958333333333332 | 0 |
| 0.9965277777777778 | 0 |
| 0.9972222222222222 | 0 |
| 0.9979166666666667 | 0 |
| 0.998611111111111 | 0 |
| 0.9993055555555556 | 0 |